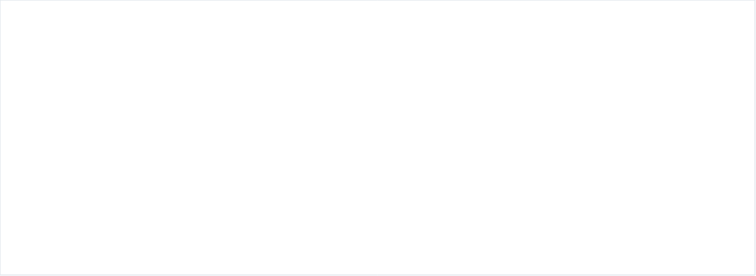
| Category | CXP CONSTITUIDAS | CANCELACIONES CXP | TOTAL PAGOS |
|---|---|---|---|
| A-FUNCIONAMIENTO | 7893.785 | 0 | 2373.19 |
| C-INVERSIÓN | 182.429 | 0 | 182.429 |